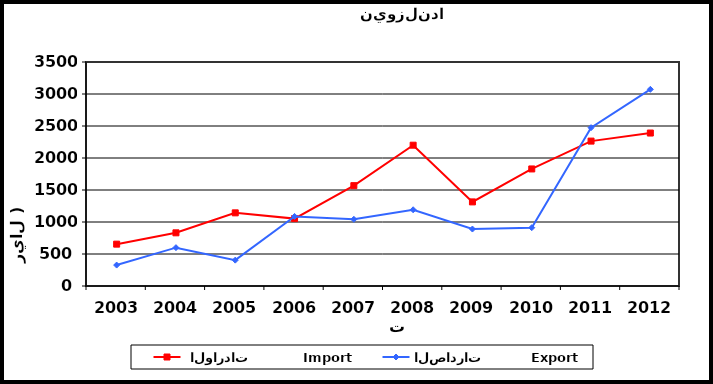
| Category |  الواردات           Import | الصادرات          Export |
|---|---|---|
| 2003.0 | 654 | 327 |
| 2004.0 | 831 | 599 |
| 2005.0 | 1143 | 404 |
| 2006.0 | 1053 | 1087 |
| 2007.0 | 1568 | 1042 |
| 2008.0 | 2200 | 1191 |
| 2009.0 | 1314 | 890 |
| 2010.0 | 1829 | 911 |
| 2011.0 | 2264 | 2474 |
| 2012.0 | 2390 | 3073 |